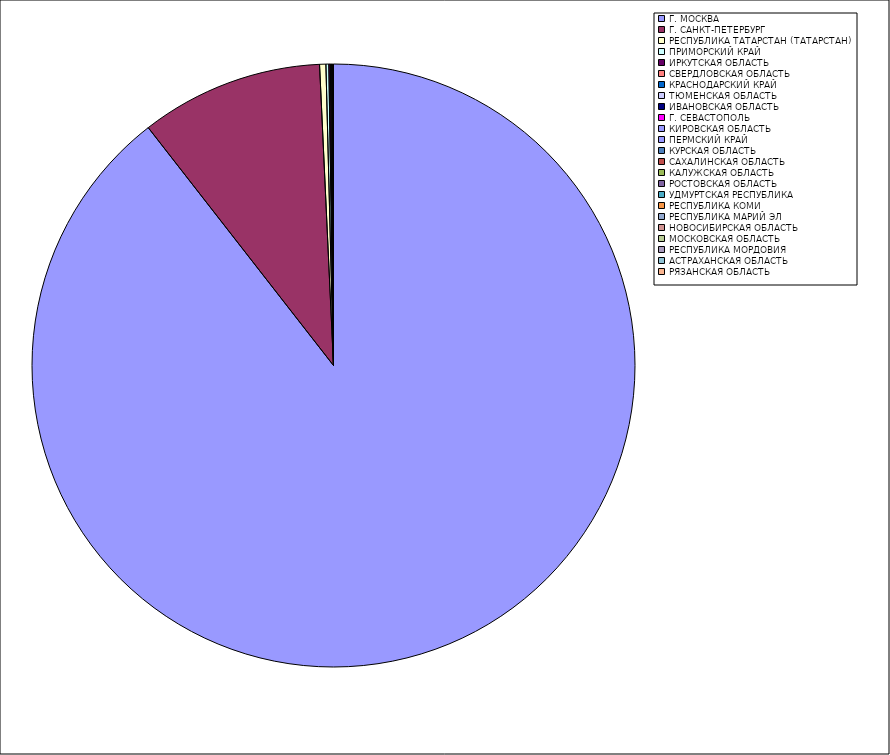
| Category | Оборот |
|---|---|
| Г. МОСКВА | 89.464 |
| Г. САНКТ-ПЕТЕРБУРГ | 9.793 |
| РЕСПУБЛИКА ТАТАРСТАН (ТАТАРСТАН) | 0.337 |
| ПРИМОРСКИЙ КРАЙ | 0.156 |
| ИРКУТСКАЯ ОБЛАСТЬ | 0.081 |
| СВЕРДЛОВСКАЯ ОБЛАСТЬ | 0.065 |
| КРАСНОДАРСКИЙ КРАЙ | 0.019 |
| ТЮМЕНСКАЯ ОБЛАСТЬ | 0.017 |
| ИВАНОВСКАЯ ОБЛАСТЬ | 0.013 |
| Г. СЕВАСТОПОЛЬ | 0.009 |
| КИРОВСКАЯ ОБЛАСТЬ | 0.009 |
| ПЕРМСКИЙ КРАЙ | 0.005 |
| КУРСКАЯ ОБЛАСТЬ | 0.005 |
| САХАЛИНСКАЯ ОБЛАСТЬ | 0.004 |
| КАЛУЖСКАЯ ОБЛАСТЬ | 0.004 |
| РОСТОВСКАЯ ОБЛАСТЬ | 0.004 |
| УДМУРТСКАЯ РЕСПУБЛИКА | 0.003 |
| РЕСПУБЛИКА КОМИ | 0.002 |
| РЕСПУБЛИКА МАРИЙ ЭЛ | 0.002 |
| НОВОСИБИРСКАЯ ОБЛАСТЬ | 0.002 |
| МОСКОВСКАЯ ОБЛАСТЬ | 0.001 |
| РЕСПУБЛИКА МОРДОВИЯ | 0.001 |
| АСТРАХАНСКАЯ ОБЛАСТЬ | 0.001 |
| РЯЗАНСКАЯ ОБЛАСТЬ | 0.001 |